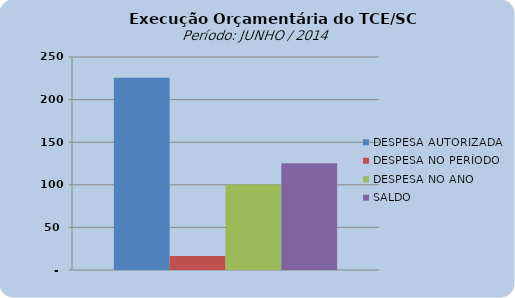
| Category | DESPESA AUTORIZADA | DESPESA NO PERÍODO | DESPESA NO ANO | SALDO |
|---|---|---|---|---|
| 0 | 225528804.02 | 16532557.21 | 100335117.56 | 125193686.46 |